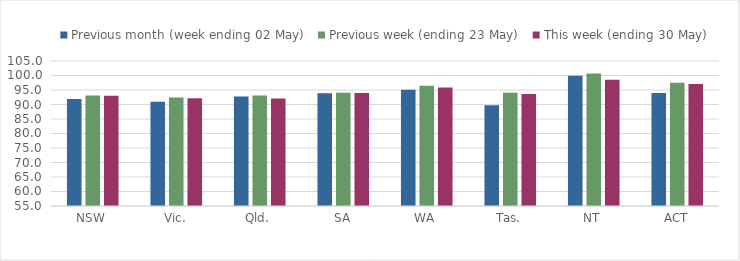
| Category | Previous month (week ending 02 May) | Previous week (ending 23 May) | This week (ending 30 May) |
|---|---|---|---|
| NSW | 91.903 | 93.09 | 92.99 |
| Vic. | 90.91 | 92.413 | 92.161 |
| Qld. | 92.725 | 93.112 | 92.081 |
| SA | 93.872 | 94.09 | 93.939 |
| WA | 95.125 | 96.486 | 95.836 |
| Tas. | 89.709 | 94.071 | 93.626 |
| NT | 99.872 | 100.683 | 98.517 |
| ACT | 93.986 | 97.504 | 97.101 |